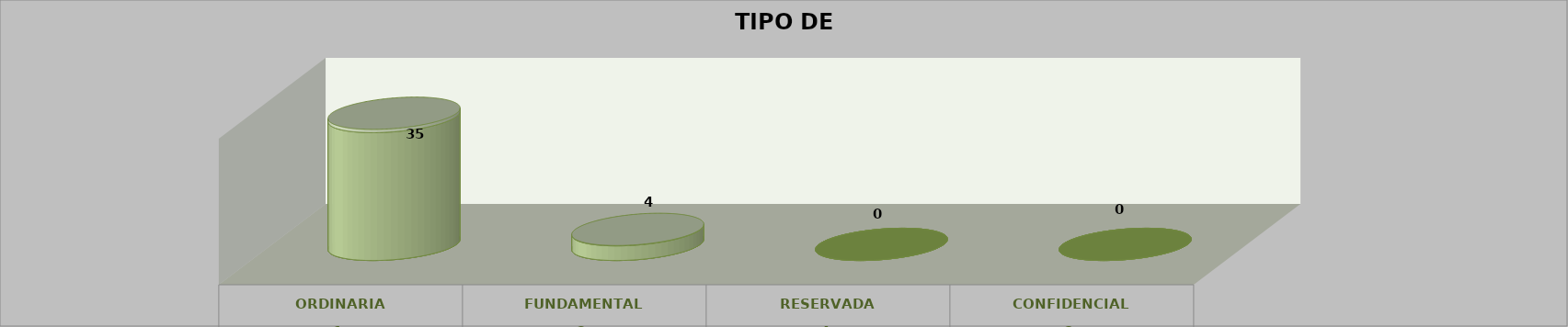
| Category | Series 0 | Series 2 | Series 1 | Series 3 | Series 4 |
|---|---|---|---|---|---|
| 0 |  |  |  | 35 | 0.897 |
| 1 |  |  |  | 4 | 0.103 |
| 2 |  |  |  | 0 | 0 |
| 3 |  |  |  | 0 | 0 |